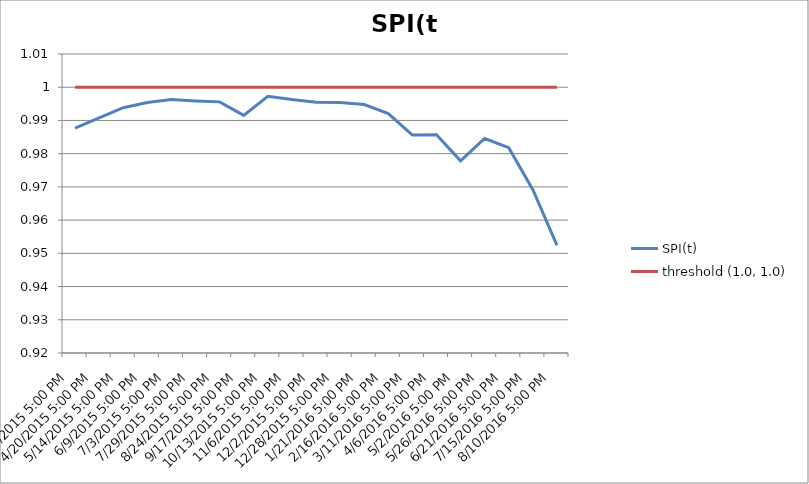
| Category | SPI(t) | threshold (1.0, 1.0) |
|---|---|---|
| 3/25/2015 5:00 PM | 0.988 | 1 |
| 4/20/2015 5:00 PM | 0.991 | 1 |
| 5/14/2015 5:00 PM | 0.994 | 1 |
| 6/9/2015 5:00 PM | 0.995 | 1 |
| 7/3/2015 5:00 PM | 0.996 | 1 |
| 7/29/2015 5:00 PM | 0.996 | 1 |
| 8/24/2015 5:00 PM | 0.996 | 1 |
| 9/17/2015 5:00 PM | 0.992 | 1 |
| 10/13/2015 5:00 PM | 0.997 | 1 |
| 11/6/2015 5:00 PM | 0.996 | 1 |
| 12/2/2015 5:00 PM | 0.996 | 1 |
| 12/28/2015 5:00 PM | 0.995 | 1 |
| 1/21/2016 5:00 PM | 0.995 | 1 |
| 2/16/2016 5:00 PM | 0.992 | 1 |
| 3/11/2016 5:00 PM | 0.986 | 1 |
| 4/6/2016 5:00 PM | 0.986 | 1 |
| 5/2/2016 5:00 PM | 0.978 | 1 |
| 5/26/2016 5:00 PM | 0.985 | 1 |
| 6/21/2016 5:00 PM | 0.982 | 1 |
| 7/15/2016 5:00 PM | 0.969 | 1 |
| 8/10/2016 5:00 PM | 0.952 | 1 |